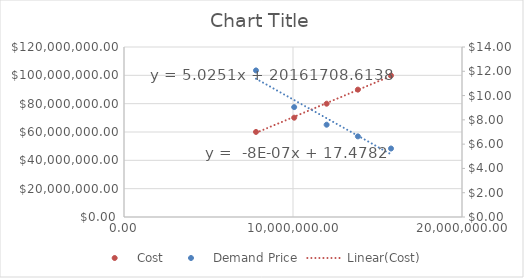
| Category | Cost |
|---|---|
| 7810000.0 | 60050000 |
| 10070000.0 | 70090000 |
| 11990000.0 | 79980000 |
| 13840000.0 | 89900000 |
| 15800000.0 | 99830000 |